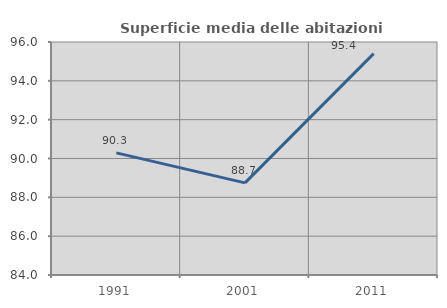
| Category | Superficie media delle abitazioni occupate |
|---|---|
| 1991.0 | 90.292 |
| 2001.0 | 88.746 |
| 2011.0 | 95.404 |